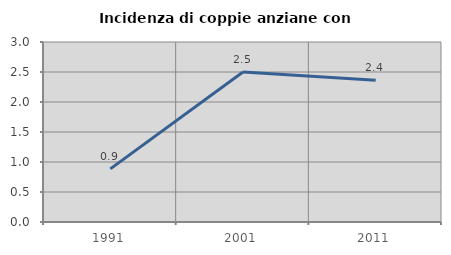
| Category | Incidenza di coppie anziane con figli |
|---|---|
| 1991.0 | 0.885 |
| 2001.0 | 2.5 |
| 2011.0 | 2.362 |